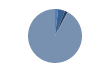
| Category | Series 0 |
|---|---|
| ARRASTRE | 18 |
| CERCO | 40 |
| PALANGRE | 17 |
| REDES DE ENMALLE | 1 |
| ARTES FIJAS | 0 |
| ARTES MENORES | 886 |